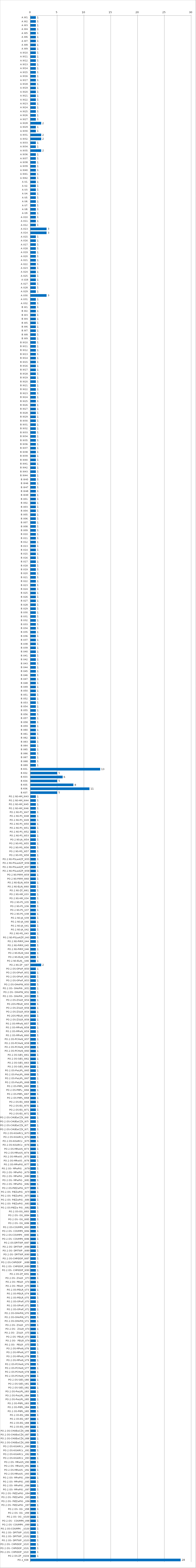
| Category | Series 0 |
|---|---|
| A.W1. | 1 |
| A.W2. | 1 |
| A.W3. | 1 |
| A.W4. | 1 |
| A.W5. | 1 |
| A.W6. | 1 |
| A.W7. | 1 |
| A.W8. | 1 |
| A.W9. | 1 |
| A.W10. | 1 |
| A.W11. | 1 |
| A.W12. | 1 |
| A.W13. | 1 |
| A.W14. | 1 |
| A.W15. | 1 |
| A.W16. | 1 |
| A.W17. | 1 |
| A.W18. | 1 |
| A.W19. | 1 |
| A.W20. | 1 |
| A.W21. | 1 |
| A.W22. | 1 |
| A.W23. | 1 |
| A.W24. | 1 |
| A.W25. | 1 |
| A.W26. | 1 |
| A.W27. | 1 |
| A.W28. | 2 |
| A.W29. | 1 |
| A.W30. | 1 |
| A.W31. | 2 |
| A.W32. | 2 |
| A.W33. | 1 |
| A.W34. | 1 |
| A.W35. | 2 |
| A.W36. | 1 |
| A.W37. | 1 |
| A.W38. | 1 |
| A.W39. | 1 |
| A.W40. | 1 |
| A.W41. | 1 |
| A.W42. | 1 |
| A.U1. | 1 |
| A.U2. | 1 |
| A.U3. | 1 |
| A.U4. | 1 |
| A.U5. | 1 |
| A.U6. | 1 |
| A.U7. | 1 |
| A.U8. | 1 |
| A.U9. | 1 |
| A.U10. | 1 |
| A.U11. | 1 |
| A.U12. | 1 |
| A.U13. | 3 |
| A.U14. | 3 |
| A.U15. | 1 |
| A.U16. | 1 |
| A.U17. | 1 |
| A.U18. | 1 |
| A.U19. | 1 |
| A.U20. | 1 |
| A.U21. | 1 |
| A.U22. | 1 |
| A.U23. | 1 |
| A.U24. | 1 |
| A.U25. | 1 |
| A.U26 | 1 |
| A.U27. | 1 |
| A.U28. | 1 |
| A.U29. | 1 |
| A.U30. | 3 |
| A.U31. | 1 |
| A.U32. | 1 |
| B.W1. | 1 |
| B.W2. | 1 |
| B.W3. | 1 |
| B.W4. | 1 |
| B.W5. | 1 |
| B.W6. | 1 |
| B.W7. | 1 |
| B.W8. | 1 |
| B.W9. | 1 |
| B.W10. | 1 |
| B.W11. | 1 |
| B.W12. | 1 |
| B.W13. | 1 |
| B.W14. | 1 |
| B.W15. | 1 |
| B.W16. | 1 |
| B.W17. | 1 |
| B.W18. | 1 |
| B.W19. | 1 |
| B.W20. | 1 |
| B.W21. | 1 |
| B.W22. | 1 |
| B.W23. | 1 |
| B.W24. | 1 |
| B.W25. | 1 |
| B.W26. | 1 |
| B.W27. | 1 |
| B.W28. | 1 |
| B.W29. | 1 |
| B.W30. | 1 |
| B.W31. | 1 |
| B.W32. | 1 |
| B.W33. | 1 |
| B.W34. | 1 |
| B.W35. | 1 |
| B.W36. | 1 |
| B.W37. | 1 |
| B.W38. | 1 |
| B.W39. | 1 |
| B.W40. | 1 |
| B.W41. | 1 |
| B.W42. | 1 |
| B.W43. | 1 |
| B.W44. | 1 |
| B.W45 | 1 |
| B.W46 | 1 |
| B.W47 | 1 |
| B.W48 | 1 |
| B.W49 | 1 |
| B.U01. | 1 |
| B.U02. | 1 |
| B.U03. | 1 |
| B.U04. | 1 |
| B.U05. | 1 |
| B.U06. | 1 |
| B.U07. | 1 |
| B.U08. | 1 |
| B.U09. | 1 |
| B.U10. | 1 |
| B.U11. | 1 |
| B.U12. | 1 |
| B.U13. | 1 |
| B.U14. | 1 |
| B.U15. | 1 |
| B.U16. | 1 |
| B.U17. | 1 |
| B.U18. | 1 |
| B.U19. | 1 |
| B.U20. | 1 |
| B.U21. | 1 |
| B.U22. | 1 |
| B.U23. | 1 |
| B.U24. | 1 |
| B.U25. | 1 |
| B.U26. | 1 |
| B.U27. | 1 |
| B.U28. | 1 |
| B.U29. | 1 |
| B.U30. | 1 |
| B.U31. | 1 |
| B.U32. | 1 |
| B.U33. | 1 |
| B.U34. | 1 |
| B.U35. | 1 |
| B.U36. | 1 |
| B.U37. | 1 |
| B.U38. | 1 |
| B.U39. | 1 |
| B.U40. | 1 |
| B.U41. | 1 |
| B.U42. | 1 |
| B.U43. | 1 |
| B.U44. | 1 |
| B.U45. | 1 |
| B.U46. | 1 |
| B.U47. | 1 |
| B.U48. | 1 |
| B.U49. | 1 |
| B.U50. | 1 |
| B.U51. | 1 |
| B.U52. | 1 |
| B.U53. | 1 |
| B.U54. | 1 |
| B.U55. | 1 |
| B.U56. | 1 |
| B.U57. | 1 |
| B.U58. | 1 |
| B.U59. | 1 |
| B.U60. | 1 |
| B.U61. | 1 |
| B.U62. | 1 |
| B.U63. | 1 |
| B.U64. | 1 |
| B.U65. | 1 |
| B.U66. | 1 |
| B.U67. | 1 |
| B.U68. | 1 |
| B.U69. | 1 |
| B.K01. | 13 |
| B.K02. | 5 |
| B.K03. | 6 |
| B.K04. | 5 |
| B.K05. | 8 |
| B.K06. | 11 |
| B.K07. | 5 |
| PO.2.NS-HM_W43 | 1 |
| PO.2.NS-HM_W44 | 1 |
| PO.2.NS-HM_W45 | 1 |
| PO.2.NS-HM_W46 | 1 |
| PO.2.NS-PS_W47 | 1 |
| PO.2.NS-PS_W48 | 1 |
| PO.2.NS-PS_W49 | 1 |
| PO.2.NS-PS_W50 | 1 |
| PO.2.NS-PS_W51 | 1 |
| PO.2.NS-PS_W52 | 1 |
| PO.2.NS-PS_W53 | 1 |
| PO.2.NS-JA_W54 | 1 |
| PO.2.NS-MS_W55 | 1 |
| PO.2.NS-MS_W56 | 1 |
| PO.2.NS-MS_W57 | 1 |
| PO.2.NS-MS_W58 | 1 |
| PO.2.NS-PSLwAZP_W55 | 1 |
| PO.2.NS-PSLwAZP_W56 | 1 |
| PO.2.NS-PSLwAZP_W57 | 1 |
| PO.2.NS-PSLwAZP_W58 | 1 |
| PO.2.NS-PiRM_W59 | 1 |
| PO.2.NS-PiRM_W60 | 1 |
| PO.2.NS-ELiN_W59 | 1 |
| PO.2.NS-ELiN_W60 | 1 |
| PO.2.NS-ZF_W61 | 1 |
| PO.2.NS-HM_U33 | 1 |
| PO.2.NS-HM_U34 | 1 |
| PO.2.NS-PS_U35 | 1 |
| PO.2.NS-PS_U36 | 1 |
| PO.2.NS-PS_U37 | 1 |
| PO.2.NS-PS_U38 | 1 |
| PO.2.NS-JA_U39 | 1 |
| PO.2.NS-JA_U40 | 1 |
| PO.2.NS-JA_U41 | 1 |
| PO.2.NS-JA_U42 | 1 |
| PO.2.NS-MS_U43 | 1 |
| PO.2.NS-PSLwAZP_U43 | 1 |
| PO.2.NS-PiRM_U44 | 1 |
| PO.2.NS-PiRM_U45 | 1 |
| PO.2.NS-PiRM_U46 | 1 |
| PO.2.NS-ELiN_U44 | 1 |
| PO.2.NS-ELiN_U45 | 1 |
| PO.2.NS-ELiN__U46 | 1 |
| PO.2.NS-ZF _U47 | 2 |
| PO.2.OS-OPwP_W50 | 1 |
| PO.2.OS-OPwP_W51 | 1 |
| PO.2.OS-OPwP_W52 | 1 |
| PO.2.OS-OPwP_W53 | 1 |
| PO.2.OS-OHnPiN_W50 | 1 |
| PO.2.OS- OHnPiN _W51 | 1 |
| PO.2.OS- OHnPiN_W52 | 1 |
| PO.2.OS- OHnPiN _W53 | 1 |
| PO.2.OS-ZSiLR_W54 | 1 |
| PO.2OS-PEiLR_W55 | 1 |
| PO.2.OS-ZSiLR_W56 | 1 |
| PO.2.OS-ZSiLR_W54 | 1 |
| PO.2OS-PEiLR_W55 | 1 |
| PO.2.OS-ZSiLR_W56 | 1 |
| PO.2.OS-MPwN_W57 | 1 |
| PO.2.OS-MPwN_W58 | 1 |
| PO.2.OS-MPwN_W59 | 1 |
| PO.2.OS-MPwN_W60 | 1 |
| PO.2.OS-PCHwN_W57 | 1 |
| PO.2.OS-PCHwN_W58 | 1 |
| PO.2.OS-PCHwN_W59 | 1 |
| PO.2.OS-PCHwN_W60 | 1 |
| PO.2.OS-SiES_W61 | 1 |
| PO.2.OS-SiES_W62 | 1 |
| PO.2.OS-SiES_W63 | 1 |
| PO.2.OS-SiES_W64 | 1 |
| PO.2.OS-PwLiPL_W65 | 1 |
| PO.2.OS-PwLiPL_W66 | 1 |
| PO.2.OS-PwLiPL_W67 | 1 |
| PO.2.OS-PwLiPL_W68 | 1 |
| PO.2.OS-PItPL_W65 | 1 |
| PO.2.OS-PItPL-_W66 | 1 |
| PO.2.OS-PItPL_W67 | 1 |
| PO.2.OS-PItPL_W68 | 1 |
| PO.2.OS-EG_W69 | 1 |
| PO.2.OS-EG_W70 | 1 |
| PO.2.OS-EG_W71 | 1 |
| PO.2.OS-EG_W72 | 1 |
| PO.2.OS-CHUEwCŻK_W69 | 1 |
| PO.2.OS-CHUEwCŻK_W70 | 1 |
| PO.2.OS-CHUEwCŻK_W71 | 1 |
| PO.2.OS-CHUEwCŻK_W72 | 1 |
| PO.2.OS-KiSARCz_W73 | 1 |
| PO.2.OS-KiSARCz_W74 | 1 |
| PO.2.OS-KiSARCz _W75 | 1 |
| PO.2.OS-KiSARCz _W76 | 1 |
| PO.2.OS-MRwUS_W73 | 1 |
| PO.2.OS-MRwUS_W74 | 1 |
| PO.2.OS-MRwUS _W75 | 1 |
| PO.2.OS-MRwUS _W76 | 1 |
| PO.2.OS-MPwPiG_W77 | 1 |
| PO.2.OS- MPwPiG  _W78 | 1 |
| PO.2.OS- MPwPiG _W79 | 1 |
| PO.2.OS- MPwPiG _W80 | 1 |
| PO.2.OS- MPwPiG _W81 | 1 |
| PO.2.OS- MPwPiG _W82 | 1 |
| PO.2.OS-PiEZwPiG_W77 | 1 |
| PO.2.OS- PiEZwPiG _W78 | 1 |
| PO.2.OS- PiEZwPiG _W79 | 1 |
| PO.2.OS- PiEZwPiG _W80 | 1 |
| PO.2.OS- PiEZwPiG _W81 | 1 |
| PO.2.OS-PiEZw PiG _W82 | 1 |
| PO.2.OS-OG_W83 | 1 |
| PO.2.OS- OG_W84 | 1 |
| PO.2.OS- OG_W85 | 1 |
| PO.2.OS- OG_W86 | 1 |
| PO.2.OS-COUMPK_W83 | 1 |
| PO.2.OS- COUMPK_W84 | 1 |
| PO.2.OS-COUMPK _W85 | 1 |
| PO.2.OS- COUMPK_W86 | 1 |
| PO.2.OS-DPiTWP_W87 | 1 |
| PO.2.OS- DPiTWP _W88 | 1 |
| PO.2.OS- DPiTWP _W89 | 1 |
| PO.2.OS- DPiTWP_W90 | 1 |
| PO.2.OS-CHPiDOP_W87 | 1 |
| PO.2.OS-CHPiDOP  _W88 | 1 |
| PO.2.OS- CHPiDOP_W89 | 1 |
| PO.2.OS- CHPiDOP_W90 | 1 |
| PO.2.OS-ZF_W91 | 1 |
| PO.2.OS- ZSiLR _U73 | 1 |
| PO.2.OS- PEiLR _U74 | 1 |
| PO.2.OS- PEiLR _U75 | 1 |
| PO.2.OS-PEiLR_U73 | 1 |
| PO.2.OS-PEiLR_U74 | 1 |
| PO.2.OS-PEiLR_U75 | 1 |
| PO.2.OS-OPwP_U70 | 1 |
| PO.2.OS-OPwP_U71 | 1 |
| PO.2.OS-OPwP_U72 | 1 |
| PO.2.OS-OHnPiN_U70 | 1 |
| PO.2.OS-OHnPiN_U71 | 1 |
| PO.2.OS-OHnPiN_U72 | 1 |
| PO.2.OS- ZSiLR _U73 | 1 |
| PO.2.OS-  ZSiLR_U74 | 1 |
| PO.2.OS-  ZSiLR _U75 | 1 |
| PO.2.OS- PEiLR_U73 | 1 |
| PO.2.OS-  PEiLR_U74 | 1 |
| PO.2.OS-  PEiLR _U75 | 1 |
| PO.2.OS-MPwN_U76 | 1 |
| PO.2.OS-MPwN_U77 | 1 |
| PO.2.OS-MPwN_U78 | 1 |
| PO.2.OS-MPwN_U79 | 1 |
| PO.2.OS-PCHwN_U76 | 1 |
| PO.2.OS-PCHwN_U77 | 1 |
| PO.2.OS-PCHwN_U78 | 1 |
| PO.2.OS-PCHwN_U79 | 1 |
| PO.2.OS-SiES_U80 | 1 |
| PO.2.OS-SiES_U81 | 1 |
| PO.2.OS-SiES_U82 | 1 |
| PO.2.OS-PwLiPL_U83 | 1 |
| PO.2.OS-PwLiPL_U84 | 1 |
| PO.2.OS-PwLiPL_U85 | 1 |
| PO.2.OS-PItPL_U83 | 1 |
| PO.2.OS-PItPL_U84 | 1 |
| PO.2.OS-PItPL_U85 | 1 |
| PO.2.OS-EG_U86 | 1 |
| PO.2.OS-EG_U87 | 1 |
| PO.2.OS-EG_U88 | 1 |
| PO.2.OS-EG_U89 | 1 |
| PO.2.OS-CHUEwCŻK_U86 | 1 |
| PO.2.OS-CHUEwCŻK_U87 | 1 |
| PO.2.OS-CHUEwCŻK_U88 | 1 |
| PO.2.OS-CHUEwCŻK_U89 | 1 |
| PO.2.OS-KiSARCz _U90 | 1 |
| PO.2.OS-KiSARCz _U91 | 1 |
| PO.2.OS-KiSARCz _U92 | 1 |
| PO.2.OS-KiSARCz _U93 | 1 |
| PO.2.OS- MRwUS_U90 | 1 |
| PO.2.OS- MRwUS_U91 | 1 |
| PO.2.OS-MRwUS _U92 | 1 |
| PO.2.OS-MRwUS _U93 | 1 |
| PO.2.OS- MPwPiG _U94 | 1 |
| PO.2.OS- MPwPiG _U95 | 1 |
| PO.2.OS- MPwPiG _U96 | 1 |
| PO.2.OS- MPwPiG _U97 | 1 |
| PO.2.OS- PiEZwPiG _U94 | 1 |
| PO.2.OS- PiEZwPiG _U95 | 1 |
| PO.2.OS- PiEZwPiG _U96 | 1 |
| PO.2.OS- PiEZwPiG _U97 | 1 |
| PO.2.OS- OG _U98 | 1 |
| PO.2.OS- OG _U99 | 1 |
| PO.2.OS- OG _U100 | 1 |
| PO.2.OS-  COUMPK_U98 | 1 |
| PO.2.OS- COUMPK _U99 | 1 |
| PO.2.OS-COUMPK  _U100 | 1 |
| PO.2.OS- DPiTWP _U101 | 1 |
| PO.2.OS- DPiTWP _U102 | 1 |
| PO.2.OS- DPiTWP _U103 | 1 |
| PO.2.OS- CHPiDOP _U101 | 1 |
| PO.2.OS- CHPiDOP _U102 | 1 |
| PO.2.OS- CHPiDOP _U103 | 1 |
| PO.2.OS-ZF _U104 | 1 |
| PO.2_K08 | 28 |